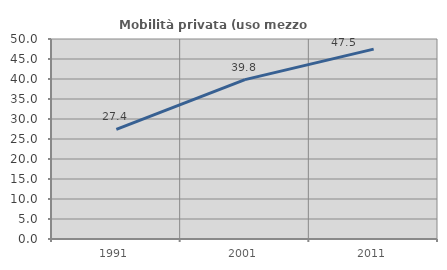
| Category | Mobilità privata (uso mezzo privato) |
|---|---|
| 1991.0 | 27.43 |
| 2001.0 | 39.837 |
| 2011.0 | 47.478 |